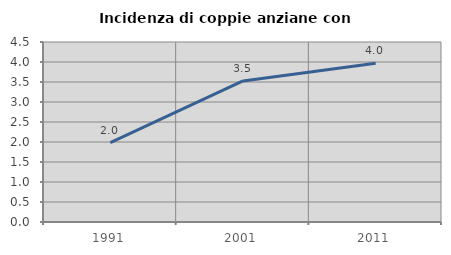
| Category | Incidenza di coppie anziane con figli |
|---|---|
| 1991.0 | 1.982 |
| 2001.0 | 3.526 |
| 2011.0 | 3.967 |